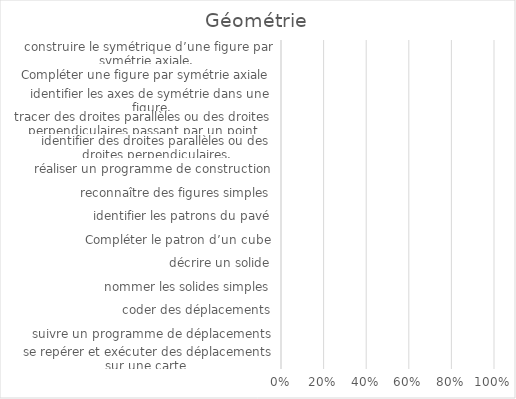
| Category | Series 0 |
|---|---|
| se repérer et exécuter des déplacements sur une carte  | 0 |
| suivre un programme de déplacements | 0 |
| coder des déplacements | 0 |
| nommer les solides simples | 0 |
| décrire un solide | 0 |
| Compléter le patron d’un cube | 0 |
| identifier les patrons du pavé | 0 |
| reconnaître des figures simples | 0 |
| réaliser un programme de construction | 0 |
| identifier des droites parallèles ou des droites perpendiculaires. | 0 |
| tracer des droites parallèles ou des droites perpendiculaires passant par un point donné. | 0 |
| identifier les axes de symétrie dans une figure. | 0 |
| Compléter une figure par symétrie axiale | 0 |
| construire le symétrique d’une figure par symétrie axiale. | 0 |